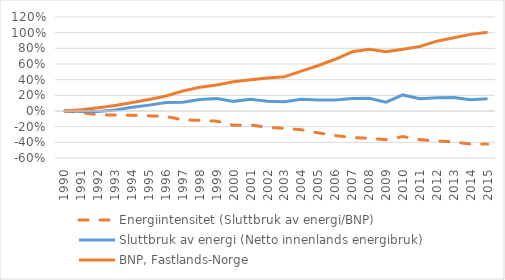
| Category | Energiintensitet (Sluttbruk av energi/BNP) | Sluttbruk av energi (Netto innenlands energibruk) | BNP, Fastlands-Norge |
|---|---|---|---|
| 1990.0 | 0 | 0 | 0 |
| 1991.0 | -0.022 | -0.007 | 0.015 |
| 1992.0 | -0.047 | -0.008 | 0.041 |
| 1993.0 | -0.053 | 0.013 | 0.07 |
| 1994.0 | -0.055 | 0.048 | 0.108 |
| 1995.0 | -0.062 | 0.075 | 0.146 |
| 1996.0 | -0.07 | 0.109 | 0.192 |
| 1997.0 | -0.113 | 0.112 | 0.254 |
| 1998.0 | -0.12 | 0.146 | 0.302 |
| 1999.0 | -0.13 | 0.16 | 0.333 |
| 2000.0 | -0.183 | 0.123 | 0.374 |
| 2001.0 | -0.179 | 0.15 | 0.4 |
| 2002.0 | -0.208 | 0.126 | 0.421 |
| 2003.0 | -0.222 | 0.119 | 0.438 |
| 2004.0 | -0.239 | 0.148 | 0.51 |
| 2005.0 | -0.279 | 0.14 | 0.581 |
| 2006.0 | -0.313 | 0.141 | 0.661 |
| 2007.0 | -0.339 | 0.161 | 0.756 |
| 2008.0 | -0.349 | 0.164 | 0.787 |
| 2009.0 | -0.366 | 0.113 | 0.756 |
| 2010.0 | -0.327 | 0.205 | 0.79 |
| 2011.0 | -0.366 | 0.157 | 0.824 |
| 2012.0 | -0.382 | 0.169 | 0.892 |
| 2013.0 | -0.395 | 0.171 | 0.935 |
| 2014.0 | -0.422 | 0.144 | 0.978 |
| 2015.0 | -0.423 | 0.158 | 1.006 |